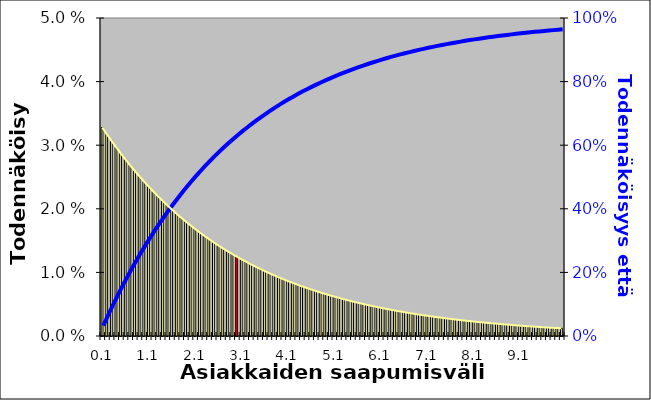
| Category | Series 1 |
|---|---|
| 0.1 | 0.033 |
| 0.2 | 0.032 |
| 0.3 | 0.031 |
| 0.4 | 0.03 |
| 0.5 | 0.029 |
| 0.6 | 0.028 |
| 0.7 | 0.027 |
| 0.8 | 0.026 |
| 0.9 | 0.025 |
| 1.0 | 0.024 |
| 1.1 | 0.023 |
| 1.2 | 0.023 |
| 1.3 | 0.022 |
| 1.4 | 0.021 |
| 1.5 | 0.021 |
| 1.6 | 0.02 |
| 1.7 | 0.019 |
| 1.8 | 0.019 |
| 1.9 | 0.018 |
| 2.0 | 0.017 |
| 2.1 | 0.017 |
| 2.2 | 0.016 |
| 2.3 | 0.016 |
| 2.4 | 0.015 |
| 2.5 | 0.015 |
| 2.6 | 0.014 |
| 2.7 | 0.014 |
| 2.8 | 0.013 |
| 2.9 | 0.013 |
| 3.0 | 0.012 |
| 3.1 | 0.012 |
| 3.2 | 0.012 |
| 3.3 | 0.011 |
| 3.4 | 0.011 |
| 3.5 | 0.011 |
| 3.6 | 0.01 |
| 3.7 | 0.01 |
| 3.8 | 0.01 |
| 3.9 | 0.009 |
| 4.0 | 0.009 |
| 4.1 | 0.009 |
| 4.2 | 0.008 |
| 4.3 | 0.008 |
| 4.4 | 0.008 |
| 4.5 | 0.008 |
| 4.6 | 0.007 |
| 4.7 | 0.007 |
| 4.8 | 0.007 |
| 4.9 | 0.007 |
| 5.0 | 0.006 |
| 5.1 | 0.006 |
| 5.2 | 0.006 |
| 5.3 | 0.006 |
| 5.4 | 0.006 |
| 5.5 | 0.005 |
| 5.6 | 0.005 |
| 5.7 | 0.005 |
| 5.8 | 0.005 |
| 5.9 | 0.005 |
| 6.0 | 0.005 |
| 6.1 | 0.004 |
| 6.2 | 0.004 |
| 6.3 | 0.004 |
| 6.4 | 0.004 |
| 6.5 | 0.004 |
| 6.6 | 0.004 |
| 6.7 | 0.004 |
| 6.8 | 0.004 |
| 6.9 | 0.003 |
| 7.0 | 0.003 |
| 7.1 | 0.003 |
| 7.2 | 0.003 |
| 7.3 | 0.003 |
| 7.4 | 0.003 |
| 7.5 | 0.003 |
| 7.6 | 0.003 |
| 7.7 | 0.003 |
| 7.8 | 0.003 |
| 7.9 | 0.002 |
| 8.0 | 0.002 |
| 8.1 | 0.002 |
| 8.2 | 0.002 |
| 8.3 | 0.002 |
| 8.4 | 0.002 |
| 8.5 | 0.002 |
| 8.6 | 0.002 |
| 8.7 | 0.002 |
| 8.8 | 0.002 |
| 8.9 | 0.002 |
| 9.0 | 0.002 |
| 9.1 | 0.002 |
| 9.2 | 0.002 |
| 9.30000000000001 | 0.002 |
| 9.4 | 0.001 |
| 9.5 | 0.001 |
| 9.60000000000001 | 0.001 |
| 9.70000000000001 | 0.001 |
| 9.80000000000001 | 0.001 |
| 9.9 | 0.001 |
| 10.0 | 0.001 |